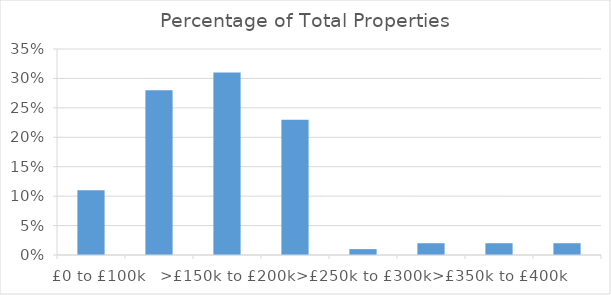
| Category | Percentage of Total Properties (%) |
|---|---|
|    £0 to £100k | 0.11 |
| >£100k to £150k | 0.28 |
| >£150k to £200k | 0.31 |
| >£200k to £250k | 0.23 |
| >£250k to £300k | 0.01 |
| >£300k to £350k | 0.02 |
| >£350k to £400k | 0.02 |
| >£400k to £450k | 0.02 |